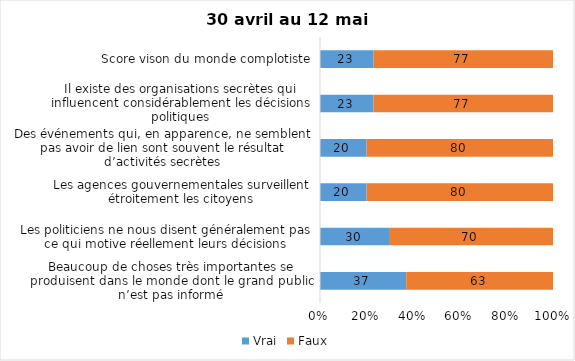
| Category | Vrai | Faux |
|---|---|---|
| Beaucoup de choses très importantes se produisent dans le monde dont le grand public n’est pas informé | 37 | 63 |
| Les politiciens ne nous disent généralement pas ce qui motive réellement leurs décisions | 30 | 70 |
| Les agences gouvernementales surveillent étroitement les citoyens | 20 | 80 |
| Des événements qui, en apparence, ne semblent pas avoir de lien sont souvent le résultat d’activités secrètes | 20 | 80 |
| Il existe des organisations secrètes qui influencent considérablement les décisions politiques | 23 | 77 |
| Score vison du monde complotiste | 23 | 77 |